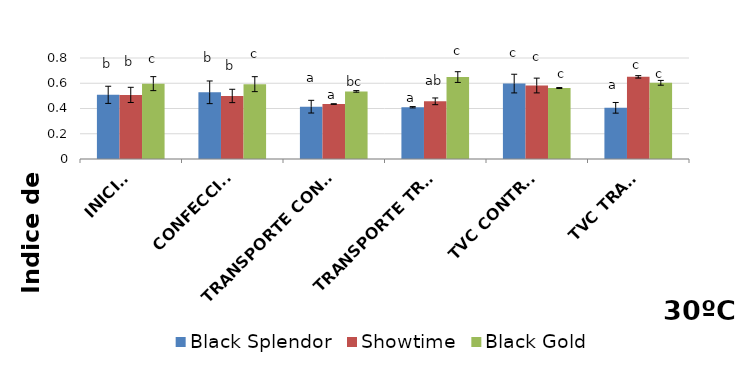
| Category | Black Splendor | Showtime | Black Gold |
|---|---|---|---|
| INICIAL | 0.508 | 0.508 | 0.597 |
| CONFECCIÓN | 0.528 | 0.499 | 0.593 |
|  TRANSPORTE CONTROL | 0.414 | 0.435 | 0.535 |
| TRANSPORTE TRAT. | 0.41 | 0.457 | 0.649 |
| TVC CONTROL | 0.597 | 0.582 | 0.562 |
| TVC TRAT. | 0.405 | 0.651 | 0.604 |